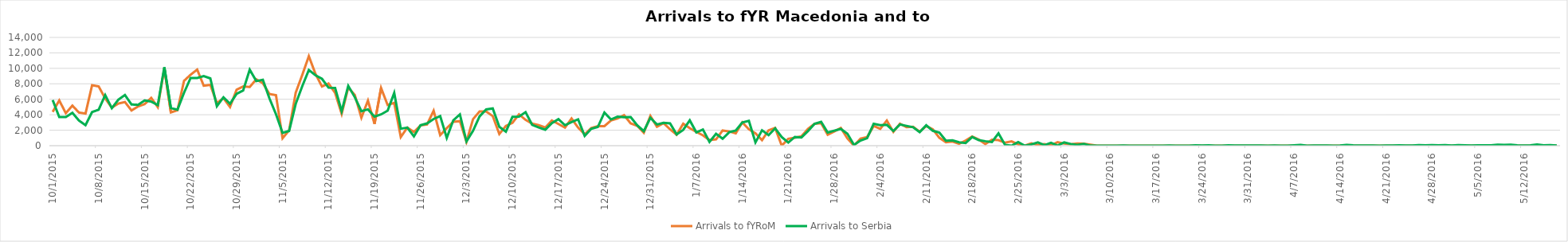
| Category | Arrivals to fYRoM | Arrivals to Serbia |
|---|---|---|
| 10/1/15 | 4370 | 5900 |
| 10/2/15 | 5853 | 3700 |
| 10/3/15 | 4202 | 3700 |
| 10/4/15 | 5181 | 4250 |
| 10/5/15 | 4282 | 3250 |
| 10/6/15 | 4156 | 2650 |
| 10/7/15 | 7816 | 4350 |
| 10/8/15 | 7663 | 4650 |
| 10/9/15 | 6107 | 6550 |
| 10/10/15 | 4922 | 4850 |
| 10/11/15 | 5448 | 5950 |
| 10/12/15 | 5645 | 6556 |
| 10/13/15 | 4551 | 5330 |
| 10/14/15 | 5073 | 5280 |
| 10/15/15 | 5373 | 5850 |
| 10/16/15 | 6181 | 5700 |
| 10/17/15 | 4988 | 5250 |
| 10/18/15 | 10005 | 10150 |
| 10/19/15 | 4299 | 4850 |
| 10/20/15 | 4584 | 4650 |
| 10/21/15 | 8384 | 6850 |
| 10/22/15 | 9174 | 8750 |
| 10/23/15 | 9840 | 8750 |
| 10/24/15 | 7752 | 9000 |
| 10/25/15 | 7864 | 8700 |
| 10/26/15 | 5500 | 5100 |
| 10/27/15 | 6146 | 6257 |
| 10/28/15 | 5000 | 5415 |
| 10/29/15 | 7231 | 6700 |
| 10/30/15 | 7663 | 7138 |
| 10/31/15 | 7590 | 9834 |
| 11/1/15 | 8584 | 8354 |
| 11/2/15 | 8075 | 8521 |
| 11/3/15 | 6682 | 6129 |
| 11/4/15 | 6532 | 4073 |
| 11/5/15 | 960 | 1652 |
| 11/6/15 | 1987 | 1906 |
| 11/7/15 | 6847 | 5397 |
| 11/8/15 | 9148 | 7695 |
| 11/9/15 | 11572 | 9785 |
| 11/10/15 | 9305 | 9107 |
| 11/11/15 | 7651 | 8648 |
| 11/12/15 | 8038 | 7500 |
| 11/13/15 | 6826 | 7464 |
| 11/14/15 | 4107 | 4453 |
| 11/15/15 | 7511 | 7734 |
| 11/16/15 | 6557 | 6267 |
| 11/17/15 | 3621 | 4460 |
| 11/18/15 | 5831 | 4694 |
| 11/19/15 | 2816 | 3765 |
| 11/20/15 | 7453 | 4042 |
| 11/21/15 | 5255 | 4527 |
| 11/22/15 | 5539 | 6826 |
| 11/23/15 | 1113 | 2201 |
| 11/24/15 | 2347 | 2335 |
| 11/25/15 | 1779 | 1194 |
| 11/26/15 | 2617 | 2636 |
| 11/27/15 | 2744 | 2878 |
| 11/28/15 | 4520 | 3454 |
| 11/29/15 | 1373 | 3825 |
| 11/30/15 | 2270 | 1009 |
| 12/1/15 | 3094 | 3284 |
| 12/2/15 | 3174 | 4040 |
| 12/3/15 | 494 | 553 |
| 12/4/15 | 3436 | 1927 |
| 12/5/15 | 4430 | 3799 |
| 12/6/15 | 4425 | 4686 |
| 12/7/15 | 3826 | 4823 |
| 12/8/15 | 1508 | 2437 |
| 12/9/15 | 2550 | 1807 |
| 12/10/15 | 2956 | 3723 |
| 12/11/15 | 4047 | 3747 |
| 12/12/15 | 3338 | 4339 |
| 12/13/15 | 2849 | 2698 |
| 12/14/15 | 2644 | 2353 |
| 12/15/15 | 2349 | 2067 |
| 12/16/15 | 3264 | 2916 |
| 12/17/15 | 2801 | 3438 |
| 12/18/15 | 2332 | 2649 |
| 12/19/15 | 3515 | 3052 |
| 12/20/15 | 2338 | 3405 |
| 12/21/15 | 1470 | 1253 |
| 12/22/15 | 2272 | 2186 |
| 12/23/15 | 2529 | 2415 |
| 12/24/15 | 2529 | 4279 |
| 12/25/15 | 3268 | 3390 |
| 12/26/15 | 3521 | 3757 |
| 12/27/15 | 3938 | 3674 |
| 12/28/15 | 2884 | 3708 |
| 12/29/15 | 2577 | 2629 |
| 12/30/15 | 1665 | 1879 |
| 12/31/15 | 3848 | 3602 |
| 1/1/16 | 2454 | 2745 |
| 1/2/16 | 2918 | 2947 |
| 1/3/16 | 2112 | 2889 |
| 1/4/16 | 1415 | 1462 |
| 1/5/16 | 2842 | 2041 |
| 1/6/16 | 2258 | 3273 |
| 1/7/16 | 1776 | 1715 |
| 1/8/16 | 1344 | 2100 |
| 1/9/16 | 715 | 489 |
| 1/10/16 | 819 | 1538 |
| 1/11/16 | 1959 | 905 |
| 1/12/16 | 1840 | 1743 |
| 1/13/16 | 1600 | 1973 |
| 1/14/16 | 3022 | 3006 |
| 1/15/16 | 2119 | 3213 |
| 1/16/16 | 1598 | 415 |
| 1/17/16 | 720 | 1995 |
| 1/18/16 | 1980 | 1362 |
| 1/19/16 | 2298 | 2244 |
| 1/20/16 | 0 | 1113 |
| 1/21/16 | 892 | 397 |
| 1/22/16 | 1030 | 1134 |
| 1/23/16 | 1208 | 1064 |
| 1/24/16 | 2174 | 1895 |
| 1/25/16 | 2836 | 2827 |
| 1/26/16 | 2908 | 3091 |
| 1/27/16 | 1402 | 1695 |
| 1/28/16 | 1837 | 1940 |
| 1/29/16 | 2292 | 2167 |
| 1/30/16 | 931 | 1540 |
| 1/31/16 | 0 | 103 |
| 2/1/16 | 908 | 660 |
| 2/2/16 | 1121 | 966 |
| 2/3/16 | 2558 | 2825 |
| 2/4/16 | 2173 | 2653 |
| 2/5/16 | 3259 | 2694 |
| 2/6/16 | 1780 | 1901 |
| 2/7/16 | 2838 | 2739 |
| 2/8/16 | 2392 | 2563 |
| 2/9/16 | 2441 | 2379 |
| 2/10/16 | 1817 | 1758 |
| 2/11/16 | 2540 | 2636 |
| 2/12/16 | 2115 | 1923 |
| 2/13/16 | 1019 | 1699 |
| 2/14/16 | 452 | 641 |
| 2/15/16 | 542 | 691 |
| 2/16/16 | 234 | 443 |
| 2/17/16 | 668 | 345 |
| 2/18/16 | 1200 | 1117 |
| 2/19/16 | 799 | 713 |
| 2/20/16 | 209 | 580 |
| 2/21/16 | 774 | 476 |
| 2/22/16 | 714 | 1595 |
| 2/23/16 | 382 | 106 |
| 2/24/16 | 551 | 1 |
| 2/25/16 | 168 | 475 |
| 2/26/16 | 20 | 0 |
| 2/27/16 | 310 | 158 |
| 2/28/16 | 92 | 431 |
| 2/29/16 | 208 | 69 |
| 3/1/16 | 30 | 372 |
| 3/2/16 | 457 | 16 |
| 3/3/16 | 269 | 428 |
| 3/4/16 | 177 | 218 |
| 3/5/16 | 293 | 115 |
| 3/6/16 | 261 | 236 |
| 3/7/16 | 127 | 14 |
| 3/8/16 | 0 | 0 |
| 3/9/16 | 0 | 3 |
| 3/10/16 | 0 | 0 |
| 3/11/16 | 0 | 0 |
| 3/12/16 | 0 | 35 |
| 3/13/16 | 0 | 12 |
| 3/14/16 | 0 | 0 |
| 3/15/16 | 0 | 0 |
| 3/16/16 | 0 | 0 |
| 3/17/16 | 0 | 0 |
| 3/18/16 | 0 | 0 |
| 3/19/16 | 0 | 30 |
| 3/20/16 | 0 | 0 |
| 3/21/16 | 0 | 0 |
| 3/22/16 | 0 | 0 |
| 3/23/16 | 0 | 49 |
| 3/24/16 | 0 | 31 |
| 3/25/16 | 0 | 40 |
| 3/26/16 | 0 | 0 |
| 3/27/16 | 0 | 4 |
| 3/28/16 | 0 | 42 |
| 3/29/16 | 0 | 37 |
| 3/30/16 | 0 | 21 |
| 3/31/16 | 0 | 14 |
| 4/1/16 | 0 | 28 |
| 4/2/16 | 0 | 32 |
| 4/3/16 | 0 | 10 |
| 4/4/16 | 0 | 28 |
| 4/5/16 | 0 | 0 |
| 4/6/16 | 0 | 4 |
| 4/7/16 | 0 | 58 |
| 4/8/16 | 0 | 93 |
| 4/9/16 | 0 | 8 |
| 4/10/16 | 0 | 30 |
| 4/11/16 | 0 | 34 |
| 4/12/16 | 0 | 22 |
| 4/13/16 | 0 | 3 |
| 4/14/16 | 0 | 34 |
| 4/15/16 | 0 | 90 |
| 4/16/16 | 0 | 41 |
| 4/17/16 | 0 | 15 |
| 4/18/16 | 0 | 17 |
| 4/19/16 | 0 | 34 |
| 4/20/16 | 0 | 5 |
| 4/21/16 | 0 | 31 |
| 4/22/16 | 0 | 19 |
| 4/23/16 | 0 | 45 |
| 4/24/16 | 0 | 38 |
| 4/25/16 | 0 | 34 |
| 4/26/16 | 0 | 73 |
| 4/27/16 | 0 | 54 |
| 4/28/16 | 0 | 69 |
| 4/29/16 | 0 | 59 |
| 4/30/16 | 0 | 80 |
| 5/1/16 | 0 | 26 |
| 5/2/16 | 0 | 81 |
| 5/3/16 | 0 | 50 |
| 5/4/16 | 0 | 25 |
| 5/5/16 | 0 | 58 |
| 5/6/16 | 0 | 49 |
| 5/7/16 | 0 | 59 |
| 5/8/16 | 0 | 128 |
| 5/9/16 | 0 | 113 |
| 5/10/16 | 0 | 119 |
| 5/11/16 | 0 | 62 |
| 5/12/16 | 0 | 33 |
| 5/13/16 | 0 | 51 |
| 5/14/16 | 0 | 161 |
| 5/15/16 | 0 | 45 |
| 5/16/16 | 0 | 71 |
| 5/17/16 | 0 | 17 |